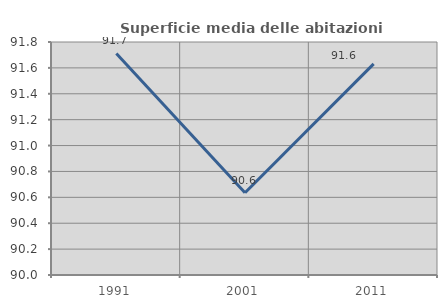
| Category | Superficie media delle abitazioni occupate |
|---|---|
| 1991.0 | 91.712 |
| 2001.0 | 90.636 |
| 2011.0 | 91.631 |